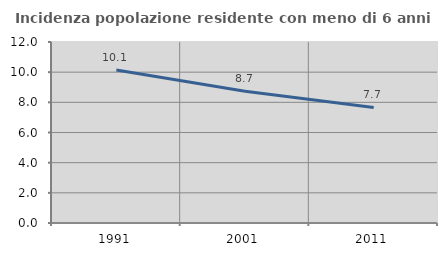
| Category | Incidenza popolazione residente con meno di 6 anni |
|---|---|
| 1991.0 | 10.141 |
| 2001.0 | 8.737 |
| 2011.0 | 7.663 |